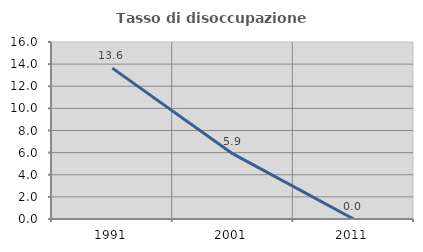
| Category | Tasso di disoccupazione giovanile  |
|---|---|
| 1991.0 | 13.636 |
| 2001.0 | 5.882 |
| 2011.0 | 0 |